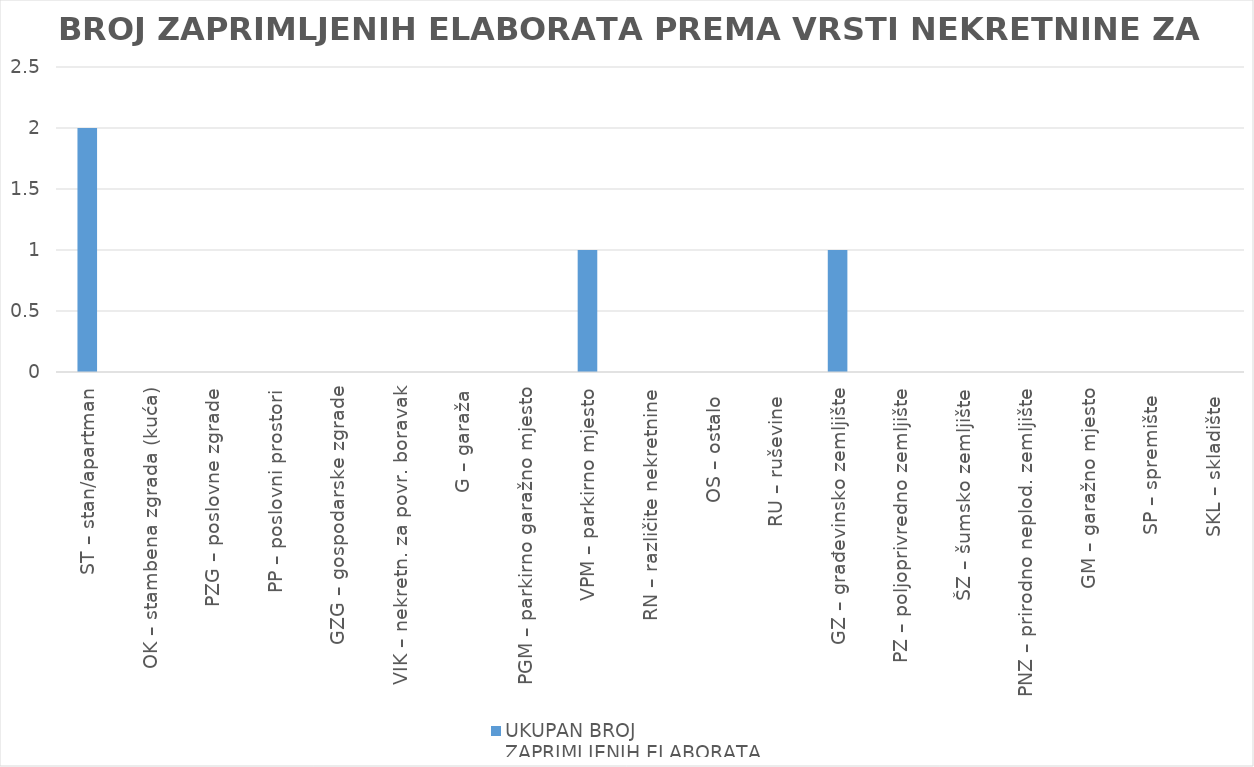
| Category | UKUPAN BROJ 
ZAPRIMLJENIH ELABORATA |
|---|---|
| ST – stan/apartman | 2 |
| OK – stambena zgrada (kuća) | 0 |
| PZG – poslovne zgrade | 0 |
| PP – poslovni prostori | 0 |
| GZG – gospodarske zgrade | 0 |
| VIK – nekretn. za povr. boravak | 0 |
| G – garaža | 0 |
| PGM – parkirno garažno mjesto | 0 |
| VPM – parkirno mjesto | 1 |
| RN – različite nekretnine | 0 |
| OS – ostalo  | 0 |
| RU – ruševine  | 0 |
| GZ – građevinsko zemljište | 1 |
| PZ – poljoprivredno zemljište | 0 |
| ŠZ – šumsko zemljište | 0 |
| PNZ – prirodno neplod. zemljište | 0 |
| GM – garažno mjesto | 0 |
| SP – spremište  | 0 |
| SKL – skladište  | 0 |